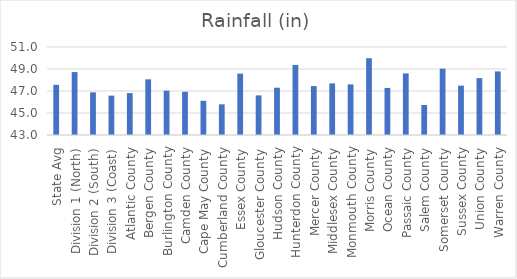
| Category | Rainfall (in) |
|---|---|
| State Avg | 47.56 |
| Division 1 (North) | 48.72 |
| Division 2 (South) | 46.88 |
| Division 3 (Coast) | 46.58 |
| Atlantic County | 46.81 |
| Bergen County | 48.06 |
| Burlington County | 47.03 |
| Camden County | 46.93 |
| Cape May County | 46.11 |
| Cumberland County | 45.79 |
| Essex County | 48.58 |
| Gloucester County | 46.6 |
| Hudson County | 47.3 |
| Hunterdon County | 49.37 |
| Mercer County | 47.45 |
| Middlesex County | 47.69 |
| Monmouth County | 47.6 |
| Morris County | 49.98 |
| Ocean County | 47.28 |
| Passaic County | 48.6 |
| Salem County | 45.73 |
| Somerset County | 49.03 |
| Sussex County | 47.49 |
| Union County | 48.17 |
| Warren County | 48.78 |